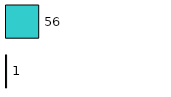
| Category | Series 0 | Series 1 |
|---|---|---|
| 0 | 1 | 56 |